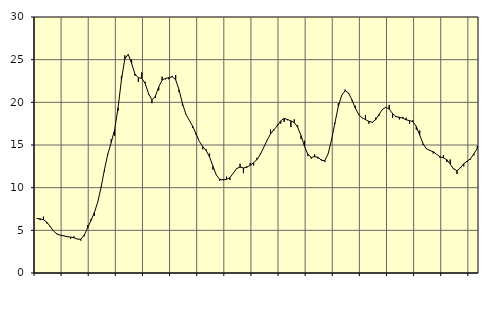
| Category | Piggar | Series 1 |
|---|---|---|
| nan | 6.4 | 6.39 |
| 87.0 | 6.2 | 6.35 |
| 87.0 | 6.6 | 6.24 |
| 87.0 | 5.8 | 5.96 |
| nan | 5.5 | 5.44 |
| 88.0 | 4.9 | 4.91 |
| 88.0 | 4.6 | 4.56 |
| 88.0 | 4.4 | 4.43 |
| nan | 4.4 | 4.35 |
| 89.0 | 4.2 | 4.26 |
| 89.0 | 4 | 4.21 |
| 89.0 | 4.3 | 4.13 |
| nan | 4 | 3.97 |
| 90.0 | 3.8 | 3.96 |
| 90.0 | 4.3 | 4.42 |
| 90.0 | 5.6 | 5.26 |
| nan | 6.3 | 6.15 |
| 91.0 | 6.7 | 7.06 |
| 91.0 | 8.3 | 8.29 |
| 91.0 | 10.1 | 10.04 |
| nan | 11.9 | 12.13 |
| 92.0 | 13.9 | 13.96 |
| 92.0 | 15.7 | 15.3 |
| 92.0 | 16.1 | 16.8 |
| nan | 19 | 19.35 |
| 93.0 | 23.1 | 22.62 |
| 93.0 | 25.5 | 25.1 |
| 93.0 | 25.6 | 25.63 |
| nan | 25 | 24.55 |
| 94.0 | 23.1 | 23.32 |
| 94.0 | 22.4 | 22.87 |
| 94.0 | 23.5 | 22.83 |
| nan | 22.4 | 22.22 |
| 95.0 | 20.9 | 21.02 |
| 95.0 | 19.9 | 20.28 |
| 95.0 | 20.5 | 20.71 |
| nan | 21.4 | 21.8 |
| 96.0 | 23 | 22.6 |
| 96.0 | 22.7 | 22.81 |
| 96.0 | 22.7 | 22.89 |
| nan | 23.1 | 22.99 |
| 97.0 | 23.2 | 22.65 |
| 97.0 | 21.2 | 21.46 |
| 97.0 | 19.6 | 19.87 |
| nan | 18.6 | 18.64 |
| 98.0 | 17.9 | 17.91 |
| 98.0 | 17 | 17.21 |
| 98.0 | 16.2 | 16.34 |
| nan | 15.4 | 15.4 |
| 99.0 | 14.5 | 14.82 |
| 99.0 | 14.5 | 14.35 |
| 99.0 | 14 | 13.59 |
| nan | 12.1 | 12.51 |
| 0.0 | 11.5 | 11.48 |
| 0.0 | 10.8 | 10.98 |
| 0.0 | 11 | 10.91 |
| nan | 11.3 | 10.97 |
| 1.0 | 10.9 | 11.18 |
| 1.0 | 11.7 | 11.69 |
| 1.0 | 12.2 | 12.25 |
| nan | 12.8 | 12.41 |
| 2.0 | 11.7 | 12.31 |
| 2.0 | 12.5 | 12.39 |
| 2.0 | 12.9 | 12.62 |
| nan | 12.6 | 12.92 |
| 3.0 | 13.5 | 13.3 |
| 3.0 | 14 | 13.92 |
| 3.0 | 14.7 | 14.74 |
| nan | 15.6 | 15.56 |
| 4.0 | 16.8 | 16.3 |
| 4.0 | 16.7 | 16.8 |
| 4.0 | 17.4 | 17.25 |
| nan | 17.5 | 17.83 |
| 5.0 | 17.7 | 18.12 |
| 5.0 | 17.9 | 17.99 |
| 5.0 | 17.1 | 17.83 |
| nan | 18 | 17.62 |
| 6.0 | 17.3 | 17.09 |
| 6.0 | 15.7 | 16.09 |
| 6.0 | 15.5 | 14.86 |
| nan | 13.7 | 13.92 |
| 7.0 | 13.4 | 13.55 |
| 7.0 | 13.9 | 13.63 |
| 7.0 | 13.4 | 13.57 |
| nan | 13.3 | 13.21 |
| 8.0 | 13 | 13.16 |
| 8.0 | 14 | 13.98 |
| 8.0 | 15.7 | 15.62 |
| nan | 17.5 | 17.61 |
| 9.0 | 19.9 | 19.53 |
| 9.0 | 20.8 | 20.83 |
| 9.0 | 21.5 | 21.36 |
| nan | 21 | 21.1 |
| 10.0 | 20.2 | 20.3 |
| 10.0 | 19.6 | 19.33 |
| 10.0 | 18.5 | 18.58 |
| nan | 18.2 | 18.19 |
| 11.0 | 18.5 | 17.98 |
| 11.0 | 17.5 | 17.77 |
| 11.0 | 17.6 | 17.66 |
| nan | 18.2 | 17.96 |
| 12.0 | 18.4 | 18.58 |
| 12.0 | 19.1 | 19.16 |
| 12.0 | 19.4 | 19.42 |
| nan | 19.7 | 19.21 |
| 13.0 | 18.2 | 18.69 |
| 13.0 | 18.4 | 18.32 |
| 13.0 | 18 | 18.25 |
| nan | 18.3 | 18.14 |
| 14.0 | 18.2 | 17.95 |
| 14.0 | 17.5 | 17.86 |
| 14.0 | 17.9 | 17.73 |
| nan | 16.8 | 17.18 |
| 15.0 | 16.7 | 16.17 |
| 15.0 | 15 | 15.15 |
| 15.0 | 14.6 | 14.55 |
| nan | 14.3 | 14.36 |
| 16.0 | 14 | 14.21 |
| 16.0 | 13.9 | 13.91 |
| 16.0 | 13.5 | 13.62 |
| nan | 13.8 | 13.49 |
| 17.0 | 13 | 13.29 |
| 17.0 | 13.3 | 12.77 |
| 17.0 | 12.3 | 12.19 |
| nan | 11.6 | 11.99 |
| 18.0 | 12.4 | 12.3 |
| 18.0 | 12.5 | 12.81 |
| 18.0 | 13 | 13.1 |
| nan | 13.3 | 13.39 |
| 19.0 | 13.8 | 13.98 |
| 19.0 | 14.9 | 14.61 |